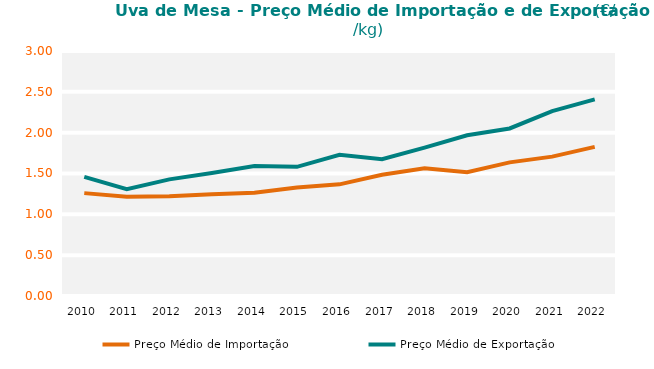
| Category | Preço Médio de Importação | Preço Médio de Exportação |
|---|---|---|
| 2010.0 | 1.26 | 1.459 |
| 2011.0 | 1.215 | 1.307 |
| 2012.0 | 1.221 | 1.428 |
| 2013.0 | 1.244 | 1.505 |
| 2014.0 | 1.265 | 1.591 |
| 2015.0 | 1.328 | 1.582 |
| 2016.0 | 1.367 | 1.729 |
| 2017.0 | 1.484 | 1.675 |
| 2018.0 | 1.565 | 1.817 |
| 2019.0 | 1.514 | 1.969 |
| 2020.0 | 1.636 | 2.052 |
| 2021.0 | 1.707 | 2.263 |
| 2022.0 | 1.826 | 2.407 |